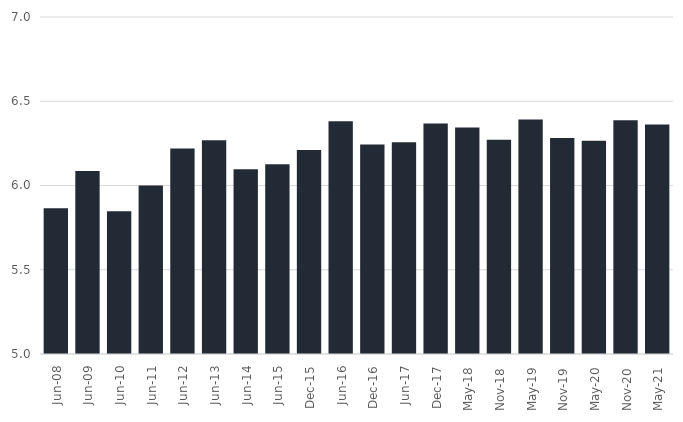
| Category | Series 0 |
|---|---|
| 2008-06-01 | 5.866 |
| 2009-06-01 | 6.086 |
| 2010-06-01 | 5.848 |
| 2011-06-01 | 6 |
| 2012-06-01 | 6.219 |
| 2013-06-01 | 6.268 |
| 2014-06-01 | 6.097 |
| 2015-06-01 | 6.127 |
| 2015-12-01 | 6.211 |
| 2016-06-01 | 6.382 |
| 2016-12-01 | 6.243 |
| 2017-06-01 | 6.257 |
| 2017-12-01 | 6.368 |
| 2018-05-01 | 6.344 |
| 2018-11-01 | 6.272 |
| 2019-05-01 | 6.392 |
| 2019-11-01 | 6.281 |
| 2020-05-01 | 6.265 |
| 2020-11-01 | 6.388 |
| 2021-05-01 | 6.362 |